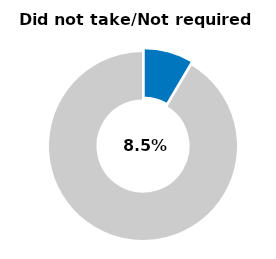
| Category | Series 0 |
|---|---|
| Did not take/not required | 0.085 |
| Other | 0.915 |